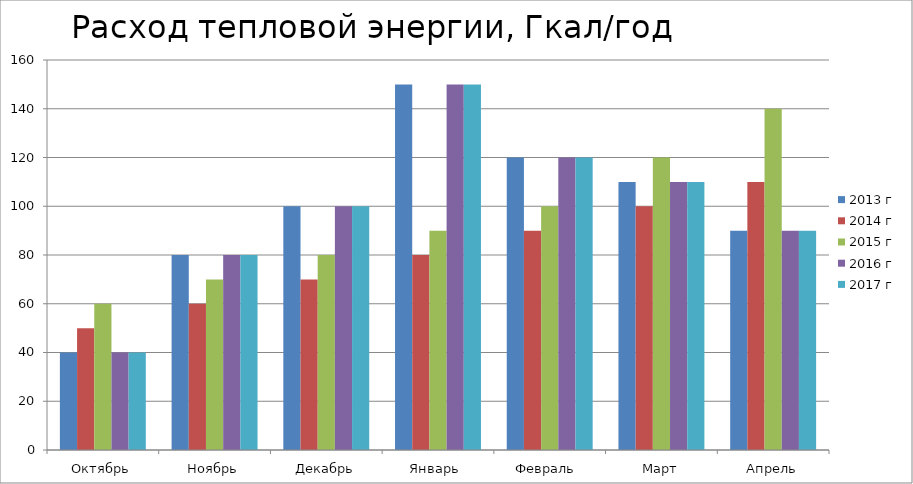
| Category | 2013 г | 2014 г | 2015 г | 2016 г | 2017 г |
|---|---|---|---|---|---|
| Октябрь | 40 | 50 | 60 | 40 | 40 |
| Ноябрь | 80 | 60 | 70 | 80 | 80 |
| Декабрь | 100 | 70 | 80 | 100 | 100 |
| Январь  | 150 | 80 | 90 | 150 | 150 |
| Февраль  | 120 | 90 | 100 | 120 | 120 |
| Март | 110 | 100 | 120 | 110 | 110 |
| Апрель | 90 | 110 | 140 | 90 | 90 |